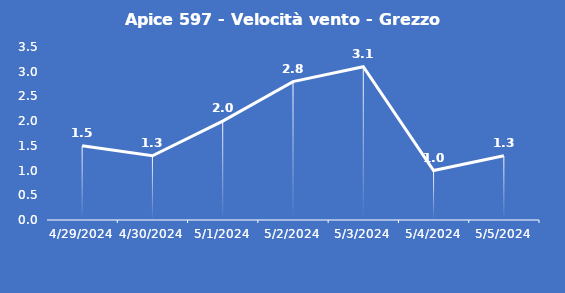
| Category | Apice 597 - Velocità vento - Grezzo (m/s) |
|---|---|
| 4/29/24 | 1.5 |
| 4/30/24 | 1.3 |
| 5/1/24 | 2 |
| 5/2/24 | 2.8 |
| 5/3/24 | 3.1 |
| 5/4/24 | 1 |
| 5/5/24 | 1.3 |